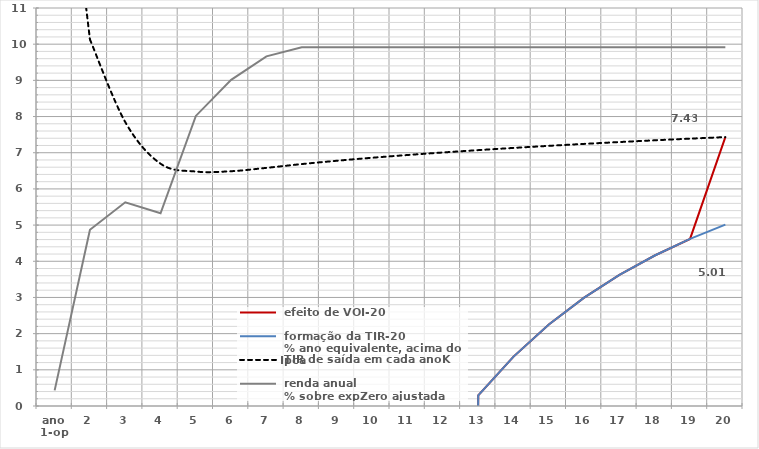
| Category |  efeito de VOI-20 |  formação da TIR-20
 % ano equivalente, acima do Ipca |  TIR de saída em cada anoK |  renda anual
 % sobre expZero ajustada |
|---|---|---|---|---|
| ano
1-op | -100 | -100 | 18.289 | 0.432 |
| 2 | -100 | -100 | 10.13 | 4.869 |
| 3 | -100 | -100 | 7.847 | 5.63 |
| 4 | -100 | -100 | 6.697 | 5.325 |
| 5 | -100 | -100 | 6.48 | 8.017 |
| 6 | -100 | -100 | 6.489 | 9.015 |
| 7 | -100 | -100 | 6.582 | 9.663 |
| 8 | -100 | -100 | 6.687 | 9.912 |
| 9 | -100 | -100 | 6.779 | 9.912 |
| 10 | -100 | -100 | 6.862 | 9.912 |
| 11 | -100 | -100 | 6.937 | 9.912 |
| 12 | -100 | -100 | 7.007 | 9.912 |
| 13 | 0.295 | 0.295 | 7.072 | 9.912 |
| 14 | 1.365 | 1.365 | 7.133 | 9.912 |
| 15 | 2.253 | 2.253 | 7.19 | 9.912 |
| 16 | 2.996 | 2.996 | 7.244 | 9.912 |
| 17 | 3.625 | 3.625 | 7.295 | 9.912 |
| 18 | 4.159 | 4.159 | 7.343 | 9.912 |
| 19 | 4.617 | 4.617 | 7.389 | 9.912 |
| 20 | 7.432 | 5.012 | 7.432 | 9.912 |